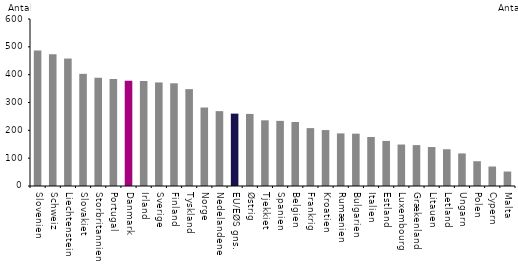
| Category | Ph.d.-forløb pr. mio. indbyggere |
|---|---|
| Slovenien | 487 |
| Schweiz | 473 |
| Liechtenstein | 458 |
| Slovakiet | 403 |
| Storbritannien | 389 |
| Portugal | 384 |
| Danmark | 378 |
| Irland | 377 |
| Sverige | 372 |
| Finland | 369 |
| Tyskland | 348 |
| Norge | 282 |
| Nedelandene | 269 |
| EU/EØS gns. | 260 |
| Østrig | 259 |
| Tjekkiet | 236 |
| Spanien | 234 |
| Belgien | 230 |
| Frankrig | 208 |
| Kroatien | 201 |
| Rumænien | 189 |
| Bulgarien | 188 |
| Italien | 176 |
| Estland | 162 |
| Luxembourg | 149 |
| Grækenland | 147 |
| Litauen | 140 |
| Letland | 132 |
| Ungarn | 117 |
| Polen | 89 |
| Cypern | 70 |
| Malta | 52 |